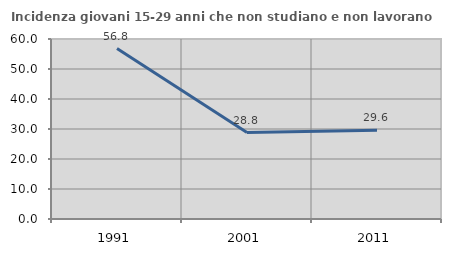
| Category | Incidenza giovani 15-29 anni che non studiano e non lavorano  |
|---|---|
| 1991.0 | 56.824 |
| 2001.0 | 28.824 |
| 2011.0 | 29.565 |